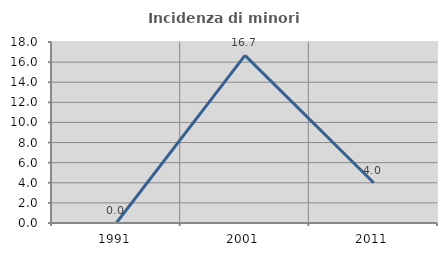
| Category | Incidenza di minori stranieri |
|---|---|
| 1991.0 | 0 |
| 2001.0 | 16.667 |
| 2011.0 | 4 |